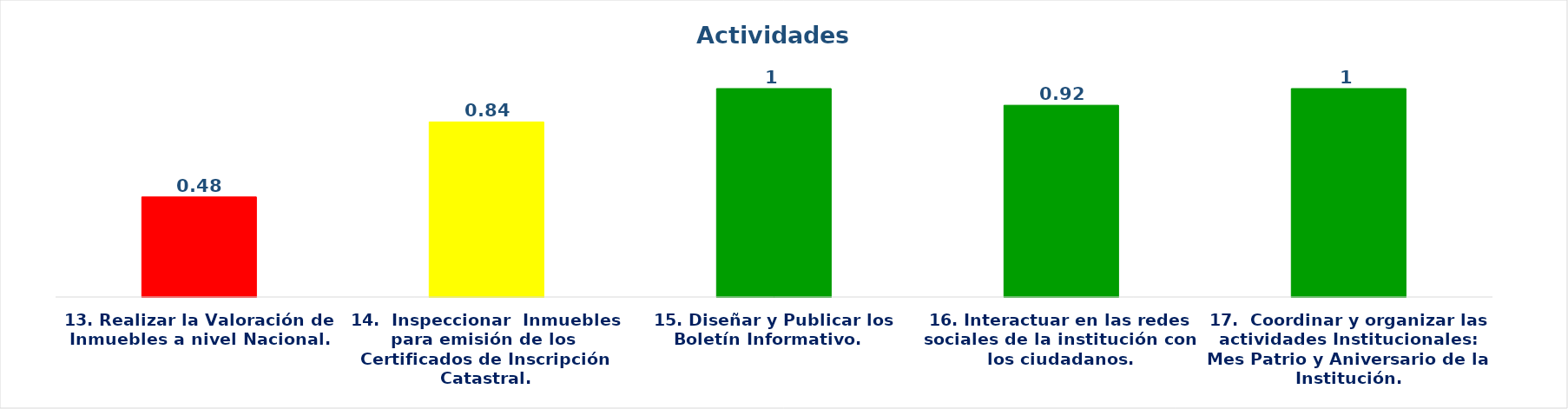
| Category | Series 0 |
|---|---|
| 13. Realizar la Valoración de Inmuebles a nivel Nacional.
 | 0.48 |
| 14.  Inspeccionar  Inmuebles para emisión de los  Certificados de Inscripción Catastral.
 | 0.84 |
| 15. Diseñar y Publicar los Boletín Informativo.   | 1 |
| 16. Interactuar en las redes sociales de la institución con los ciudadanos. | 0.92 |
| 17.  Coordinar y organizar las actividades Institucionales: Mes Patrio y Aniversario de la Institución. | 1 |